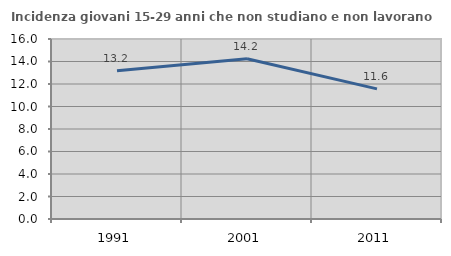
| Category | Incidenza giovani 15-29 anni che non studiano e non lavorano  |
|---|---|
| 1991.0 | 13.18 |
| 2001.0 | 14.243 |
| 2011.0 | 11.565 |